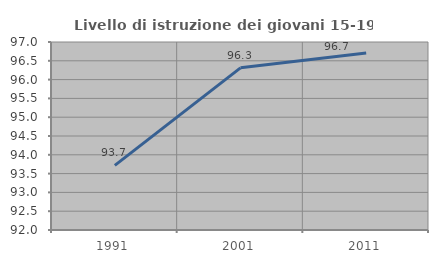
| Category | Livello di istruzione dei giovani 15-19 anni |
|---|---|
| 1991.0 | 93.718 |
| 2001.0 | 96.313 |
| 2011.0 | 96.707 |